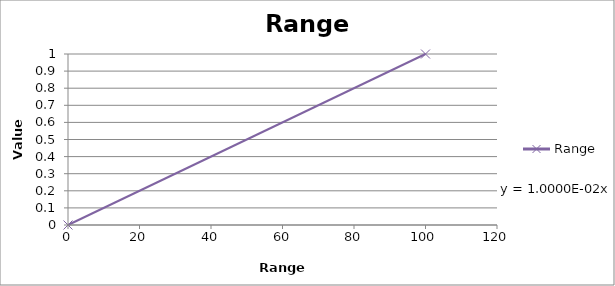
| Category | Range |
|---|---|
| 0.0 | 0 |
| nan | 0.2 |
| nan | 0.4 |
| nan | 0.5 |
| nan | 0.6 |
| nan | 0.7 |
| nan | 0.8 |
| nan | 0.85 |
| nan | 0.9 |
| nan | 0.95 |
| 100.0 | 1 |